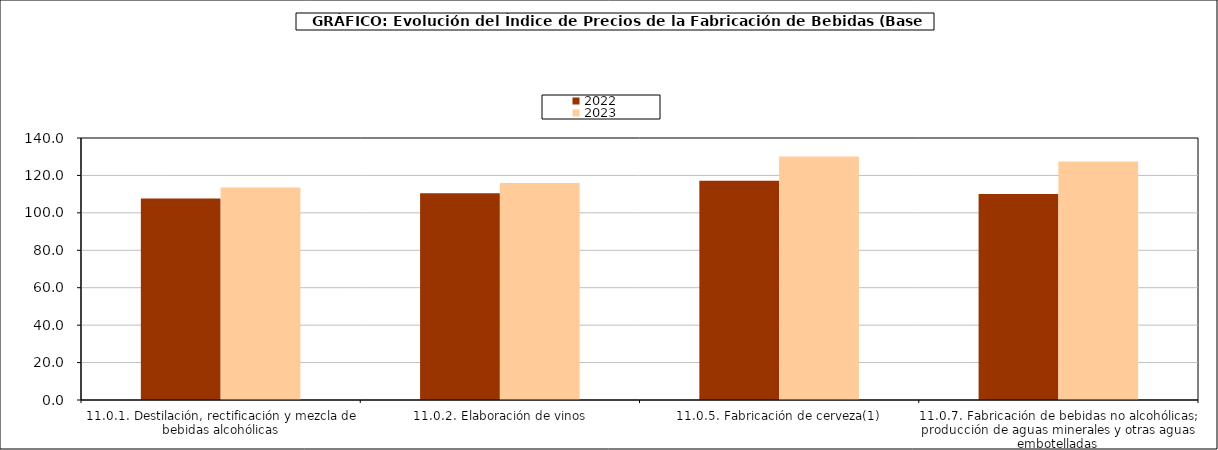
| Category | 2022 | 2023 |
|---|---|---|
| 11.0.1. Destilación, rectificación y mezcla de bebidas alcohólicas | 107.723 | 113.532 |
| 11.0.2. Elaboración de vinos | 110.481 | 115.924 |
| 11.0.5. Fabricación de cerveza(1) | 117.219 | 130.066 |
| 11.0.7. Fabricación de bebidas no alcohólicas; producción de aguas minerales y otras aguas embotelladas | 110.034 | 127.492 |